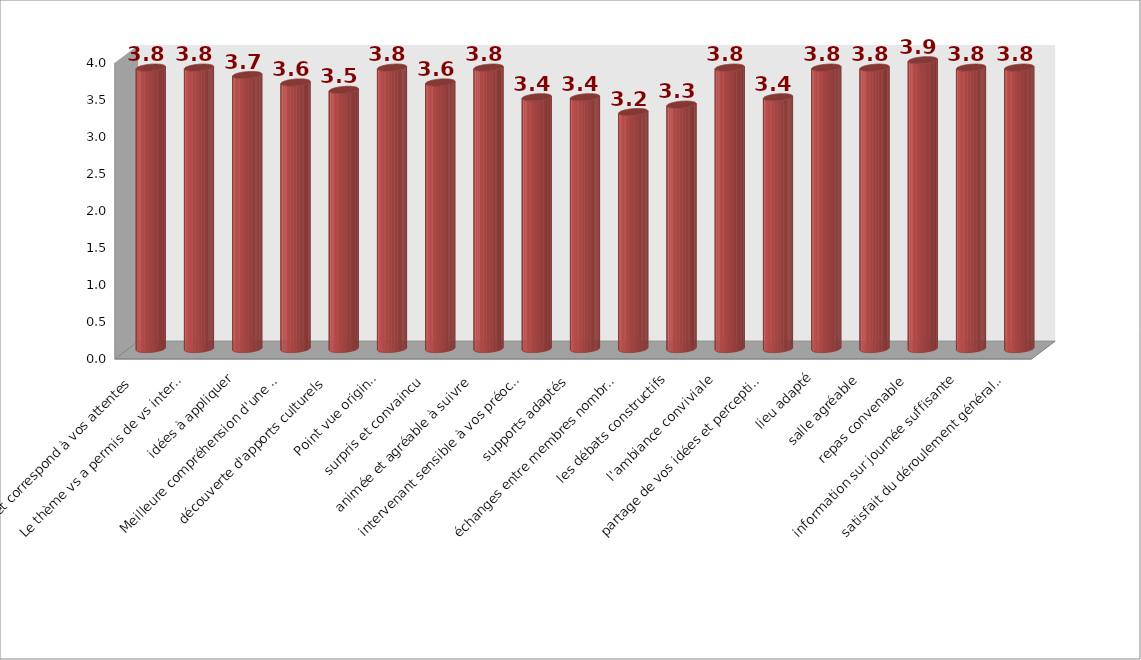
| Category | Series 1 |
|---|---|
| Sujet correspond à vos attentes | 3.8 |
| Le thème vs a permis de vs interroger sur vs mm | 3.8 |
| idées à appliquer | 3.7 |
| Meilleure compréhension d'une clé managériale | 3.6 |
| découverte d'apports culturels | 3.5 |
| Point vue original | 3.8 |
| surpris et convaincu | 3.6 |
| animée et agréable à suivre | 3.8 |
| intervenant sensible à vos préoccupations | 3.4 |
| supports adaptés | 3.4 |
| échanges entre membres nombreux | 3.2 |
| les débats constructifs | 3.3 |
| l'ambiance conviviale | 3.8 |
| partage de vos idées et perceptions | 3.4 |
| lieu adapté | 3.8 |
| salle agréable | 3.8 |
| repas convenable | 3.9 |
| information sur journée suffisante | 3.8 |
| satisfait du déroulement général réunion | 3.8 |